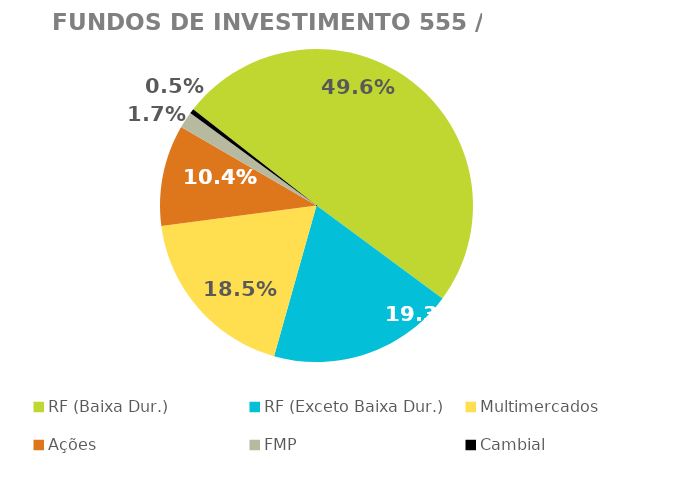
| Category | Fundos de Investimento 555 / FMP |
|---|---|
| RF (Baixa Dur.) | 0.496 |
| RF (Exceto Baixa Dur.) | 0.193 |
| Multimercados | 0.185 |
| Ações | 0.104 |
| FMP | 0.017 |
| Cambial | 0.005 |